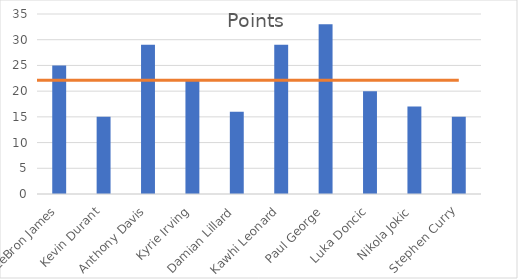
| Category | Points |
|---|---|
| LeBron James | 25 |
| Kevin Durant | 15 |
| Anthony Davis | 29 |
| Kyrie Irving | 22 |
| Damian Lillard | 16 |
| Kawhi Leonard | 29 |
| Paul George | 33 |
| Luka Doncic | 20 |
| Nikola Jokic | 17 |
| Stephen Curry | 15 |